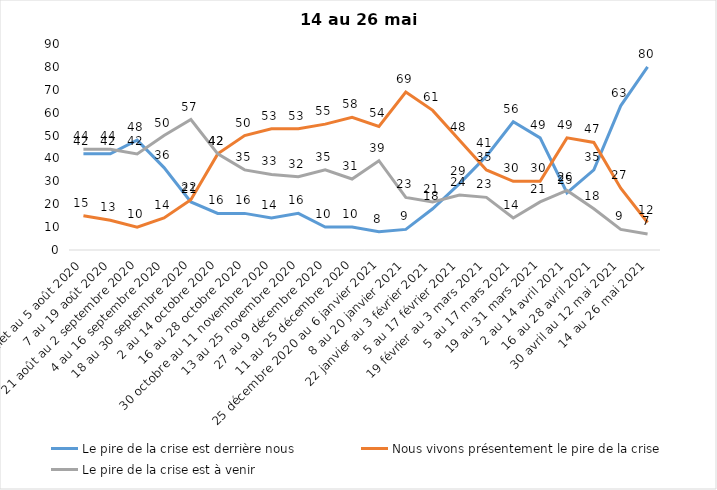
| Category | Le pire de la crise est derrière nous | Nous vivons présentement le pire de la crise | Le pire de la crise est à venir |
|---|---|---|---|
| 24 juillet au 5 août 2020 | 42 | 15 | 44 |
| 7 au 19 août 2020 | 42 | 13 | 44 |
| 21 août au 2 septembre 2020 | 48 | 10 | 42 |
| 4 au 16 septembre 2020 | 36 | 14 | 50 |
| 18 au 30 septembre 2020 | 21 | 22 | 57 |
| 2 au 14 octobre 2020 | 16 | 42 | 42 |
| 16 au 28 octobre 2020 | 16 | 50 | 35 |
| 30 octobre au 11 novembre 2020 | 14 | 53 | 33 |
| 13 au 25 novembre 2020 | 16 | 53 | 32 |
| 27 au 9 décembre 2020 | 10 | 55 | 35 |
| 11 au 25 décembre 2020 | 10 | 58 | 31 |
| 25 décembre 2020 au 6 janvier 2021 | 8 | 54 | 39 |
| 8 au 20 janvier 2021 | 9 | 69 | 23 |
| 22 janvier au 3 février 2021 | 18 | 61 | 21 |
| 5 au 17 février 2021 | 29 | 48 | 24 |
| 19 février au 3 mars 2021 | 41 | 35 | 23 |
| 5 au 17 mars 2021 | 56 | 30 | 14 |
| 19 au 31 mars 2021 | 49 | 30 | 21 |
| 2 au 14 avril 2021 | 25 | 49 | 26 |
| 16 au 28 avril 2021 | 35 | 47 | 18 |
| 30 avril au 12 mai 2021 | 63 | 27 | 9 |
| 14 au 26 mai 2021 | 80 | 12 | 7 |